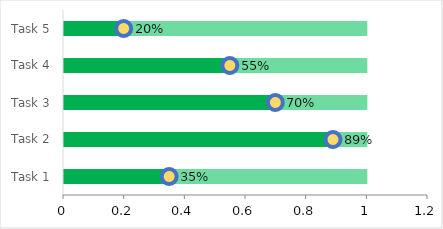
| Category | Helper 1 | Completion % |
|---|---|---|
| Task 1 | 1 | 0.35 |
| Task 2 | 1 | 0.89 |
| Task 3 | 1 | 0.7 |
| Task 4 | 1 | 0.55 |
| Task 5 | 1 | 0.2 |